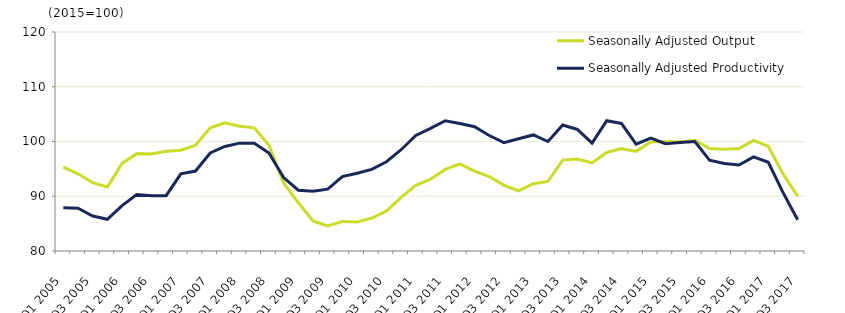
| Category | Seasonally Adjusted Output | Seasonally Adjusted Productivity |
|---|---|---|
| Q1 2005 | 95.3 | 87.9 |
| Q2 2005 | 94.1 | 87.8 |
| Q3 2005 | 92.5 | 86.4 |
| Q4 2005 | 91.7 | 85.8 |
| Q1 2006 | 96 | 88.3 |
| Q2 2006 | 97.8 | 90.3 |
| Q3 2006 | 97.7 | 90.1 |
| Q4 2006 | 98.2 | 90.1 |
| Q1 2007 | 98.4 | 94.1 |
| Q2 2007 | 99.3 | 94.6 |
| Q3 2007 | 102.5 | 97.9 |
| Q4 2007 | 103.4 | 99.1 |
| Q1 2008 | 102.8 | 99.7 |
| Q2 2008 | 102.5 | 99.7 |
| Q3 2008 | 99.3 | 97.9 |
| Q4 2008 | 92.4 | 93.4 |
| Q1 2009 | 88.8 | 91.1 |
| Q2 2009 | 85.5 | 90.9 |
| Q3 2009 | 84.6 | 91.3 |
| Q4 2009 | 85.4 | 93.6 |
| Q1 2010 | 85.3 | 94.2 |
| Q2 2010 | 86 | 94.9 |
| Q3 2010 | 87.3 | 96.3 |
| Q4 2010 | 89.8 | 98.5 |
| Q1 2011 | 92 | 101.1 |
| Q2 2011 | 93.1 | 102.4 |
| Q3 2011 | 94.9 | 103.8 |
| Q4 2011 | 95.9 | 103.3 |
| Q1 2012 | 94.6 | 102.7 |
| Q2 2012 | 93.6 | 101.1 |
| Q3 2012 | 92 | 99.8 |
| Q4 2012 | 91 | 100.5 |
| Q1 2013 | 92.3 | 101.2 |
| Q2 2013 | 92.7 | 100 |
| Q3 2013 | 96.6 | 103 |
| Q4 2013 | 96.8 | 102.2 |
| Q1 2014 | 96.1 | 99.7 |
| Q2 2014 | 98 | 103.8 |
| Q3 2014 | 98.7 | 103.3 |
| Q4 2014 | 98.2 | 99.5 |
| Q1 2015 | 99.9 | 100.6 |
| Q2 2015 | 100 | 99.6 |
| Q3 2015 | 99.9 | 99.8 |
| Q4 2015 | 100.2 | 100 |
| Q1 2016 | 98.7 | 96.6 |
| Q2 2016 | 98.6 | 96 |
| Q3 2016 | 98.7 | 95.7 |
| Q4 2016 | 100.2 | 97.2 |
| Q1 2017 | 99.1 | 96.2 |
| Q2 2017 | 94.1 | 90.7 |
| Q3 2017 | 90 | 85.7 |